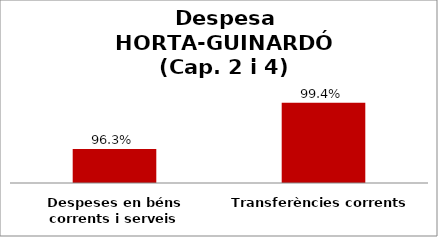
| Category | Series 0 |
|---|---|
| Despeses en béns corrents i serveis | 0.963 |
| Transferències corrents | 0.994 |